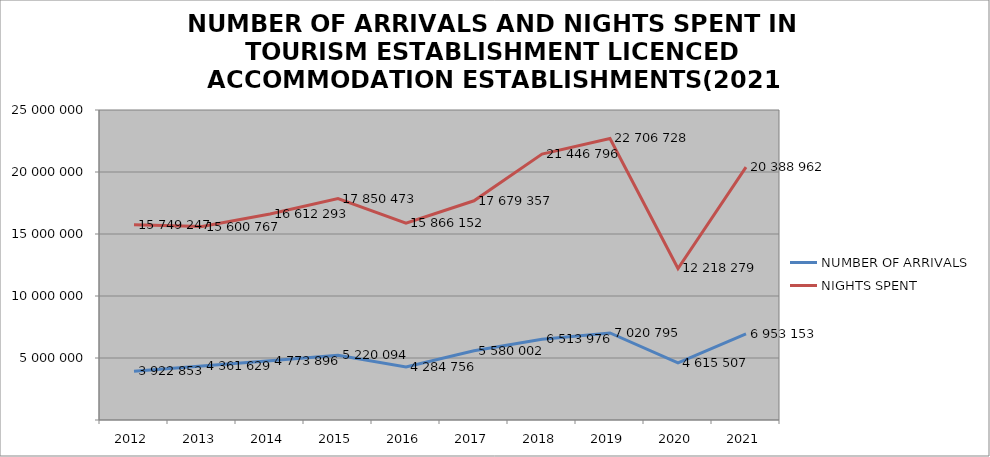
| Category | NUMBER OF ARRIVALS | NIGHTS SPENT |
|---|---|---|
| 2012 | 3922853 | 15749247 |
| 2013 | 4361629 | 15600767 |
| 2014 | 4773896 | 16612293 |
| 2015 | 5220094 | 17850473 |
| 2016 | 4284756 | 15866152 |
| 2017 | 5580002 | 17679357 |
| 2018 | 6513976 | 21446796 |
| 2019 | 7020795 | 22706728 |
| 2020 | 4615507 | 12218279 |
| 2021 | 6953153 | 20388962 |